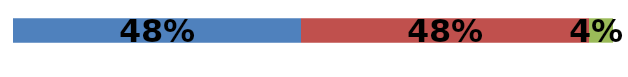
| Category | Series 0 | Series 1 | Series 2 |
|---|---|---|---|
| 0 | 0.48 | 0.48 | 0.04 |